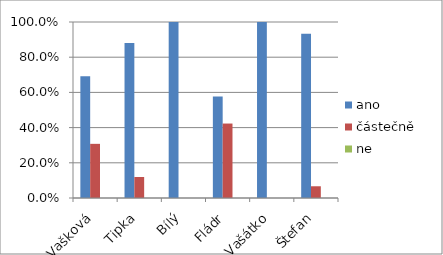
| Category | ano   | částečně   | ne |
|---|---|---|---|
| Vašková | 0.692 | 0.308 | 0 |
| Tipka | 0.881 | 0.119 | 0 |
| Bílý | 1 | 0 | 0 |
| Fládr | 0.577 | 0.423 | 0 |
| Vašátko | 1 | 0 | 0 |
| Štefan | 0.933 | 0.067 | 0 |